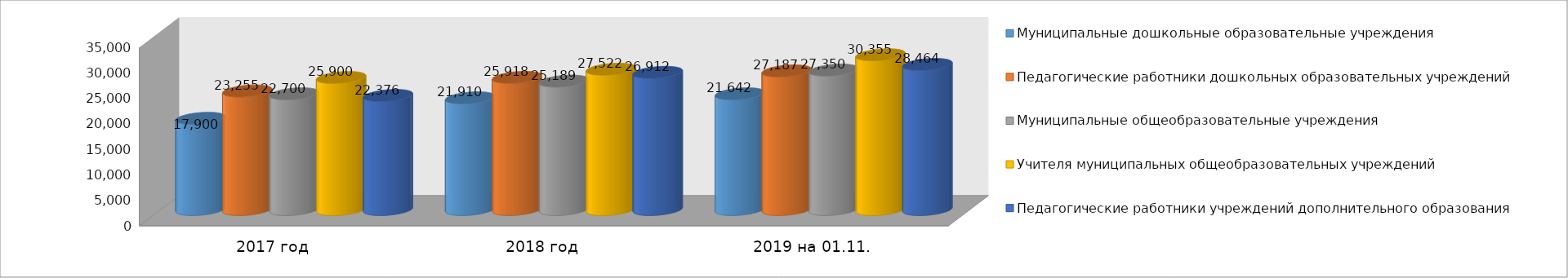
| Category | Муниципальные дошкольные образовательные учреждения | Педагогические работники дошкольных образовательных учреждений | Муниципальные общеобразовательные учреждения | Учителя муниципальных общеобразовательных учреждений | Педагогические работники учреждений дополнительного образования |
|---|---|---|---|---|---|
| 2017 год | 17900 | 23255 | 22700 | 25900 | 22376 |
| 2018 год | 21910 | 25918 | 25189 | 27522 | 26912 |
| 2019 на 01.11. | 22702 | 27187 | 27350 | 30355 | 28464 |